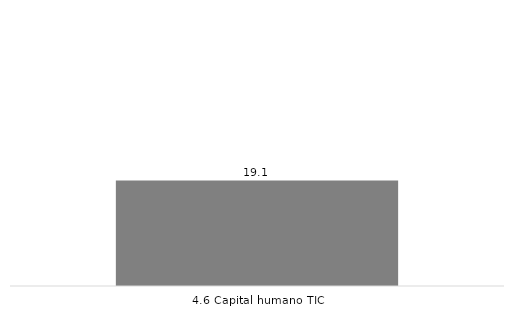
| Category | BOGOTÁ D.C. |
|---|---|
| 4.6 Capital humano TIC | 19.133 |